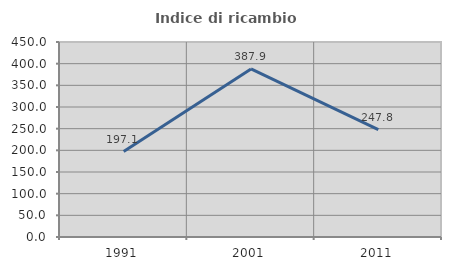
| Category | Indice di ricambio occupazionale  |
|---|---|
| 1991.0 | 197.115 |
| 2001.0 | 387.931 |
| 2011.0 | 247.778 |